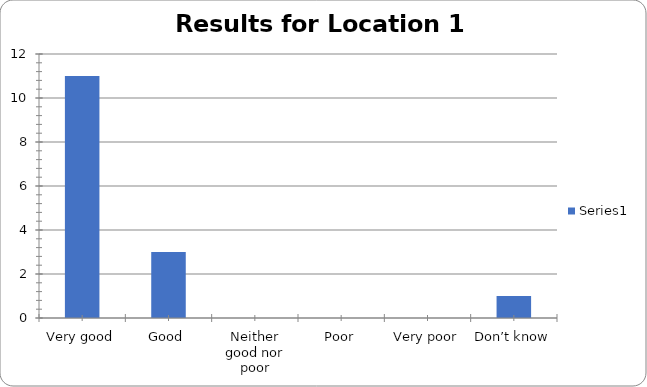
| Category | Series 0 |
|---|---|
| Very good | 11 |
| Good | 3 |
| Neither good nor poor | 0 |
| Poor | 0 |
| Very poor | 0 |
| Don’t know | 1 |